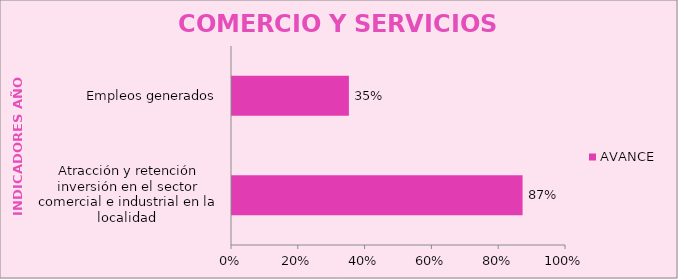
| Category | AVANCE  |
|---|---|
| Atracción y retención inversión en el sector comercial e industrial en la localidad  | 0.87 |
| Empleos generados | 0.35 |